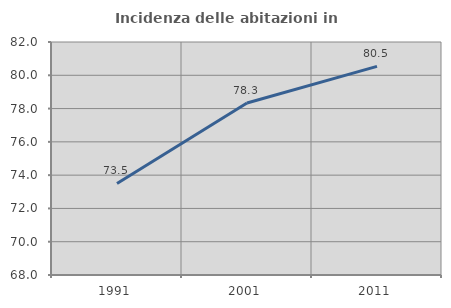
| Category | Incidenza delle abitazioni in proprietà  |
|---|---|
| 1991.0 | 73.499 |
| 2001.0 | 78.334 |
| 2011.0 | 80.535 |